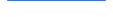
| Category | Series 0 |
|---|---|
| 0 | 191 |
| 1 | 169 |
| 2 | 169 |
| 3 | 139 |
| 4 | 147 |
| 5 | 146 |
| 6 | 96 |
| 7 | 86 |
| 8 | 73 |